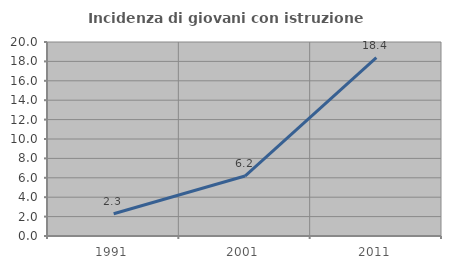
| Category | Incidenza di giovani con istruzione universitaria |
|---|---|
| 1991.0 | 2.299 |
| 2001.0 | 6.18 |
| 2011.0 | 18.4 |